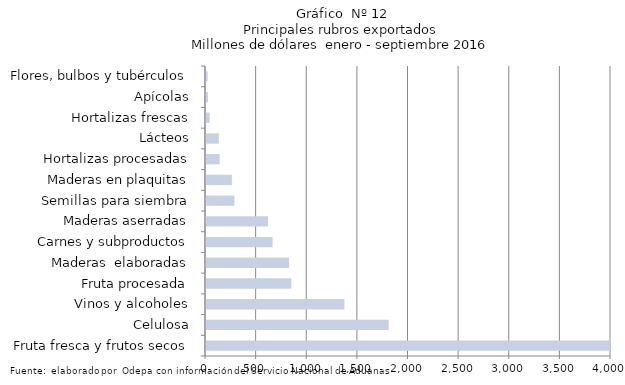
| Category | Series 7 |
|---|---|
| Fruta fresca y frutos secos | 4024605.203 |
| Celulosa | 1803673.877 |
| Vinos y alcoholes | 1367788.725 |
| Fruta procesada | 843177.433 |
| Maderas  elaboradas | 820130.204 |
| Carnes y subproductos | 657426.787 |
| Maderas aserradas | 612922.161 |
| Semillas para siembra | 280730.916 |
| Maderas en plaquitas | 255084.545 |
| Hortalizas procesadas | 135025.97 |
| Lácteos | 126635.211 |
| Hortalizas frescas | 36440.162 |
| Apícolas | 19011.841 |
| Flores, bulbos y tubérculos | 15513.418 |